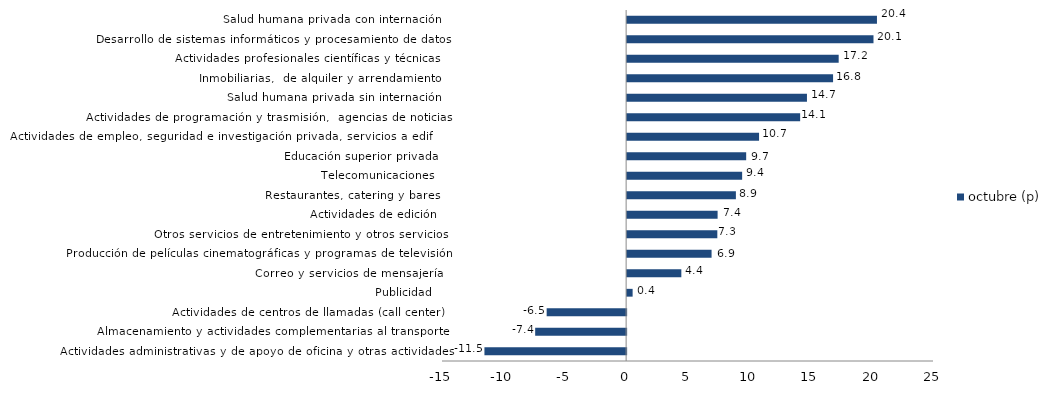
| Category | octubre (p) |
|---|---|
| Actividades administrativas y de apoyo de oficina y otras actividades | -11.543 |
| Almacenamiento y actividades complementarias al transporte | -7.409 |
| Actividades de centros de llamadas (call center) | -6.473 |
| Publicidad | 0.448 |
| Correo y servicios de mensajería | 4.416 |
| Producción de películas cinematográficas y programas de televisión | 6.88 |
| Otros servicios de entretenimiento y otros servicios | 7.348 |
| Actividades de edición | 7.371 |
| Restaurantes, catering y bares | 8.861 |
| Telecomunicaciones | 9.37 |
| Educación superior privada | 9.699 |
| Actividades de empleo, seguridad e investigación privada, servicios a edificios | 10.748 |
| Actividades de programación y trasmisión,  agencias de noticias | 14.095 |
| Salud humana privada sin internación | 14.651 |
| Inmobiliarias,  de alquiler y arrendamiento  | 16.778 |
| Actividades profesionales científicas y técnicas  | 17.235 |
| Desarrollo de sistemas informáticos y procesamiento de datos | 20.071 |
| Salud humana privada con internación | 20.353 |